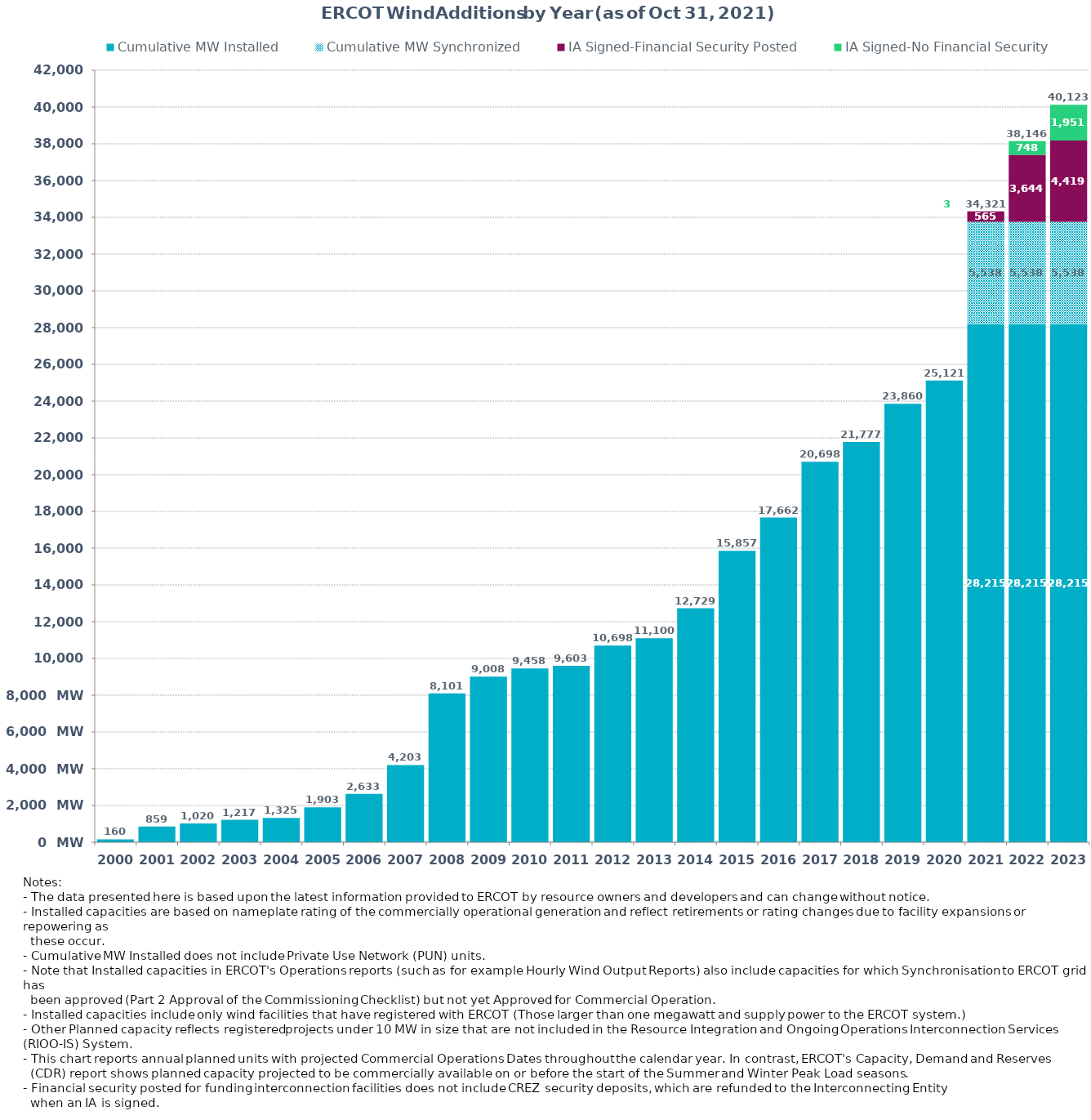
| Category | Cumulative MW Installed | Cumulative MW Synchronized | IA Signed-Financial Security Posted  | IA Signed-No Financial Security  | Other Planned | Cumulative Installed and Planned |
|---|---|---|---|---|---|---|
| 2000.0 | 160.37 | 0 | 0 | 0 | 0 | 160.37 |
| 2001.0 | 859.29 | 0 | 0 | 0 | 0 | 859.29 |
| 2002.0 | 1019.79 | 0 | 0 | 0 | 0 | 1019.79 |
| 2003.0 | 1217.29 | 0 | 0 | 0 | 0 | 1217.29 |
| 2004.0 | 1325.29 | 0 | 0 | 0 | 0 | 1325.29 |
| 2005.0 | 1902.69 | 0 | 0 | 0 | 0 | 1902.69 |
| 2006.0 | 2633.39 | 0 | 0 | 0 | 0 | 2633.39 |
| 2007.0 | 4203.41 | 0 | 0 | 0 | 0 | 4203.41 |
| 2008.0 | 8101.01 | 0 | 0 | 0 | 0 | 8101.01 |
| 2009.0 | 9007.57 | 0 | 0 | 0 | 0 | 9007.57 |
| 2010.0 | 9458.49 | 0 | 0 | 0 | 0 | 9458.49 |
| 2011.0 | 9603.49 | 0 | 0 | 0 | 0 | 9603.49 |
| 2012.0 | 10698.35 | 0 | 0 | 0 | 0 | 10698.35 |
| 2013.0 | 11100.05 | 0 | 0 | 0 | 0 | 11100.05 |
| 2014.0 | 12728.93 | 0 | 0 | 0 | 0 | 12728.93 |
| 2015.0 | 15857.48 | 0 | 0 | 0 | 0 | 15857.48 |
| 2016.0 | 17662.45 | 0 | 0 | 0 | 0 | 17662.45 |
| 2017.0 | 20697.84 | 0 | 0 | 0 | 0 | 20697.84 |
| 2018.0 | 21777 | 0 | 0 | 0 | 0 | 21777 |
| 2019.0 | 23860 | 0 | 0 | 0 | 0 | 23860 |
| 2020.0 | 25121 | 0 | 0 | 0 | 0 | 25121 |
| 2021.0 | 28215.32 | 5538 | 565 | 3 | 0 | 34321.32 |
| 2022.0 | 28215.32 | 5538.24 | 3644 | 748 | 0 | 38145.56 |
| 2023.0 | 28215.32 | 5538 | 4419.01 | 1950.6 | 0 | 40122.93 |